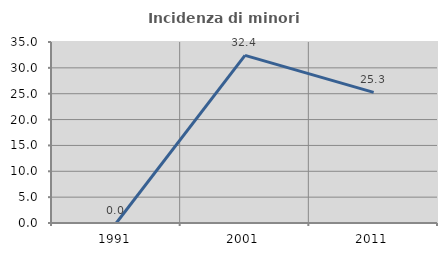
| Category | Incidenza di minori stranieri |
|---|---|
| 1991.0 | 0 |
| 2001.0 | 32.407 |
| 2011.0 | 25.258 |